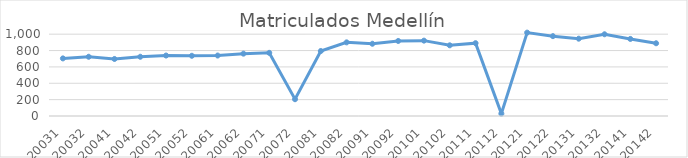
| Category | Matriculados Medellín |
|---|---|
| 20031 | 704 |
| 20032 | 724 |
| 20041 | 697 |
| 20042 | 724 |
| 20051 | 739 |
| 20052 | 736 |
| 20061 | 739 |
| 20062 | 762 |
| 20071 | 772 |
| 20072 | 205 |
| 20081 | 794 |
| 20082 | 900 |
| 20091 | 883 |
| 20092 | 917 |
| 20101 | 921 |
| 20102 | 864 |
| 20111 | 890 |
| 20112 | 29 |
| 20121 | 1019 |
| 20122 | 976 |
| 20131 | 945 |
| 20132 | 999 |
| 20141 | 942 |
| 20142 | 889 |